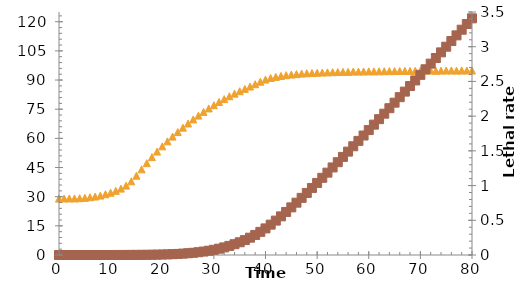
| Category | Series 0 |
|---|---|
| 0.0 | 29 |
| 1.0 | 29.05 |
| 2.0 | 29.1 |
| 3.0 | 29.1 |
| 4.0 | 29.2 |
| 5.0 | 29.4 |
| 6.0 | 29.7 |
| 7.0 | 30.05 |
| 8.0 | 30.55 |
| 9.0 | 31.25 |
| 10.0 | 32.05 |
| 11.0 | 33 |
| 12.0 | 34.15 |
| 13.0 | 35.7 |
| 14.0 | 37.9 |
| 15.0 | 40.8 |
| 16.0 | 44.05 |
| 17.0 | 47.25 |
| 18.0 | 50.35 |
| 19.0 | 53.2 |
| 20.0 | 55.9 |
| 21.0 | 58.45 |
| 22.0 | 60.9 |
| 23.0 | 63.25 |
| 24.0 | 65.5 |
| 25.0 | 67.65 |
| 26.0 | 69.75 |
| 27.0 | 71.7 |
| 28.0 | 73.6 |
| 29.0 | 75.4 |
| 30.0 | 77.05 |
| 31.0 | 78.7 |
| 32.0 | 80.2 |
| 33.0 | 81.65 |
| 34.0 | 83 |
| 35.0 | 84.25 |
| 36.0 | 85.45 |
| 37.0 | 86.65 |
| 38.0 | 87.85 |
| 39.0 | 89.15 |
| 40.0 | 90.25 |
| 41.0 | 91.05 |
| 42.0 | 91.6 |
| 43.0 | 92.1 |
| 44.0 | 92.5 |
| 45.0 | 92.8 |
| 46.0 | 93.05 |
| 47.0 | 93.3 |
| 48.0 | 93.5 |
| 49.0 | 93.6 |
| 50.0 | 93.75 |
| 51.0 | 93.85 |
| 52.0 | 93.95 |
| 53.0 | 94.05 |
| 54.0 | 94.1 |
| 55.0 | 94.2 |
| 56.0 | 94.2 |
| 57.0 | 94.35 |
| 58.0 | 94.35 |
| 59.0 | 94.4 |
| 60.0 | 94.45 |
| 61.0 | 94.45 |
| 62.0 | 94.5 |
| 63.0 | 94.55 |
| 64.0 | 94.6 |
| 65.0 | 94.6 |
| 66.0 | 94.65 |
| 67.0 | 94.7 |
| 68.0 | 94.7 |
| 69.0 | 94.75 |
| 70.0 | 94.75 |
| 71.0 | 94.75 |
| 72.0 | 94.85 |
| 73.0 | 94.8 |
| 74.0 | 94.85 |
| 75.0 | 94.9 |
| 76.0 | 94.9 |
| 77.0 | 94.85 |
| 78.0 | 94.9 |
| 79.0 | 94.9 |
| 80.0 | 94.9 |